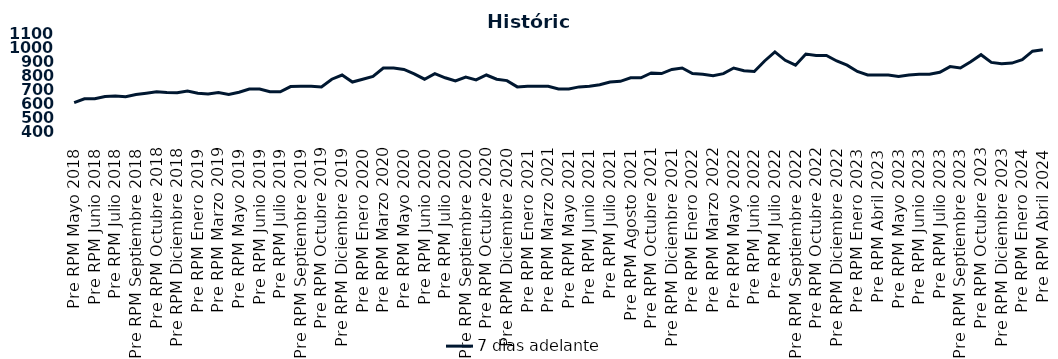
| Category | 7 días adelante  |
|---|---|
| Pre RPM Mayo 2018 | 603 |
| Post RPM Mayo 2018 | 630 |
| Pre RPM Junio 2018 | 630 |
| Post RPM Junio 2018 | 646.5 |
| Pre RPM Julio 2018 | 650 |
| Post RPM Julio 2018 | 645 |
| Pre RPM Septiembre 2018 | 660 |
| Post RPM Septiembre 2018 | 670 |
| Pre RPM Octubre 2018 | 680 |
| Post RPM Octubre 2018 | 675 |
| Pre RPM Diciembre 2018 | 672.5 |
| Post RPM Diciembre 2018 | 685 |
| Pre RPM Enero 2019 | 670 |
| Post RPM Enero 2019 | 665 |
| Pre RPM Marzo 2019 | 675 |
| Post RPM Marzo 2019 | 661 |
| Pre RPM Mayo 2019 | 677 |
| Post RPM Mayo 2019 | 700 |
| Pre RPM Junio 2019 | 700.5 |
| Post RPM Junio 2019 | 680 |
| Pre RPM Julio 2019 | 680 |
| Post RPM Julio 2019 | 717.5 |
| Pre RPM Septiembre 2019 | 720 |
| Post RPM Septiembre 2019 | 720 |
| Pre RPM Octubre 2019 | 715 |
| Post RPM Octubre 2019 | 770 |
| Pre RPM Diciembre 2019 | 800 |
| Post RPM Diciembre 2019 | 750 |
| Pre RPM Enero 2020 | 770 |
| Post RPM Enero 2020 | 790 |
| Pre RPM Marzo 2020 | 850 |
| Post RPM Marzo 2020 | 850 |
| Pre RPM Mayo 2020 | 840 |
| Post RPM Mayo 2020 | 808.5 |
| Pre RPM Junio 2020 | 770 |
| Post RPM Junio 2020 | 810 |
| Pre RPM Julio 2020 | 780 |
| Post RPM Julio 2020 | 757 |
| Pre RPM Septiembre 2020 | 785 |
| Post RPM Septiembre 2020 | 765 |
| Pre RPM Octubre 2020 | 800 |
| Post RPM Octubre 2020 | 770 |
| Pre RPM Diciembre 2020 | 760 |
| Post RPM Diciembre 2020 | 715 |
| Pre RPM Enero 2021 | 720 |
| Post RPM Enero 2021 | 720 |
| Pre RPM Marzo 2021 | 720 |
| Post RPM Marzo 2021 | 700 |
| Pre RPM Mayo 2021 | 700 |
| Post RPM Mayo 2021 | 715 |
| Pre RPM Junio 2021 | 720 |
| Post RPM Junio 2021 | 730 |
| Pre RPM Julio 2021 | 750 |
| Post RPM Julio 2021 | 755 |
| Pre RPM Agosto 2021 | 780 |
| Post RPM Agosto 2021 | 780 |
| Pre RPM Octubre 2021 | 815 |
| Post RPM Octubre 2021 | 810 |
| Pre RPM Diciembre 2021 | 840 |
| Post RPM Diciembre 2021 | 850 |
| Pre RPM Enero 2022 | 810 |
| Post RPM Enero 2022 | 805 |
| Pre RPM Marzo 2022 | 795 |
| Post RPM Marzo 2022 | 810 |
| Pre RPM Mayo 2022 | 850 |
| Post RPM Mayo 2022 | 830 |
| Pre RPM Junio 2022 | 825 |
| Post RPM Junio 2022 | 900 |
| Pre RPM Julio 2022 | 965 |
| Post RPM Julio 2022 | 905 |
| Pre RPM Septiembre 2022 | 870 |
| Post RPM Septiembre 2022 | 950 |
| Pre RPM Octubre 2022 | 940 |
| Post RPM Octubre 2022 | 940 |
| Pre RPM Diciembre 2022 | 900 |
| Post RPM Diciembre 2022 | 870 |
| Pre RPM Enero 2023 | 825 |
| Post RPM Enero 2023 | 800 |
| Pre RPM Abril 2023 | 800 |
| Post RPM Abril 2023 | 800 |
| Pre RPM Mayo 2023 | 790 |
| Post RPM Mayo 2023 | 800 |
| Pre RPM Junio 2023 | 805 |
| Post RPM Junio 2023 | 805 |
| Pre RPM Julio 2023 | 820 |
| Post RPM Julio 2023 | 860 |
| Pre RPM Septiembre 2023 | 850 |
| Post RPM Septiembre 2023 | 895 |
| Pre RPM Octubre 2023 | 945 |
| Post RPM Octubre 2023 | 890 |
| Pre RPM Diciembre 2023 | 880 |
| Post RPM Diciembre 2023 | 885 |
| Pre RPM Enero 2024 | 910 |
| Post RPM Enero 2024 | 970 |
| Pre RPM Abril 2024 | 980 |